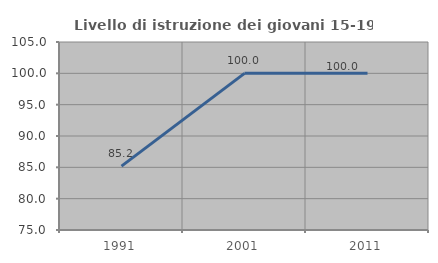
| Category | Livello di istruzione dei giovani 15-19 anni |
|---|---|
| 1991.0 | 85.185 |
| 2001.0 | 100 |
| 2011.0 | 100 |